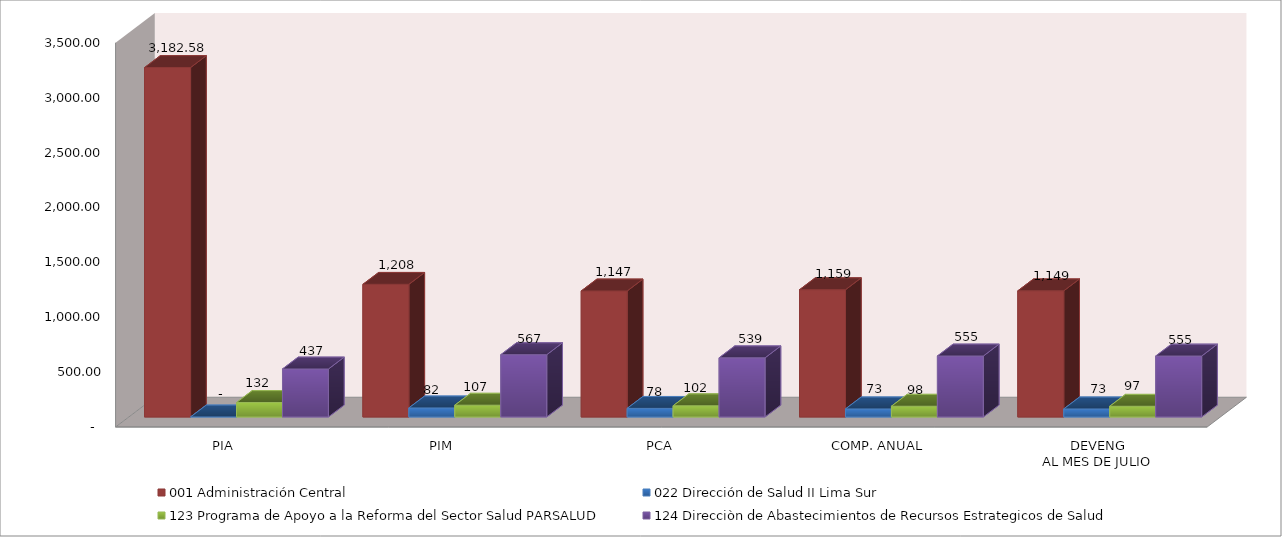
| Category | 001 Administración Central | 022 Dirección de Salud II Lima Sur | 123 Programa de Apoyo a la Reforma del Sector Salud PARSALUD | 124 Direcciòn de Abastecimientos de Recursos Estrategicos de Salud |
|---|---|---|---|---|
| PIA | 3182.583 | 0 | 131.558 | 436.9 |
| PIM | 1207.813 | 82.161 | 107.185 | 567.121 |
| PCA | 1147.422 | 78.053 | 101.826 | 538.765 |
| COMP. ANUAL | 1158.79 | 73.081 | 97.72 | 555.234 |
| DEVENG
AL MES DE JULIO | 1148.75 | 72.886 | 97.392 | 554.862 |